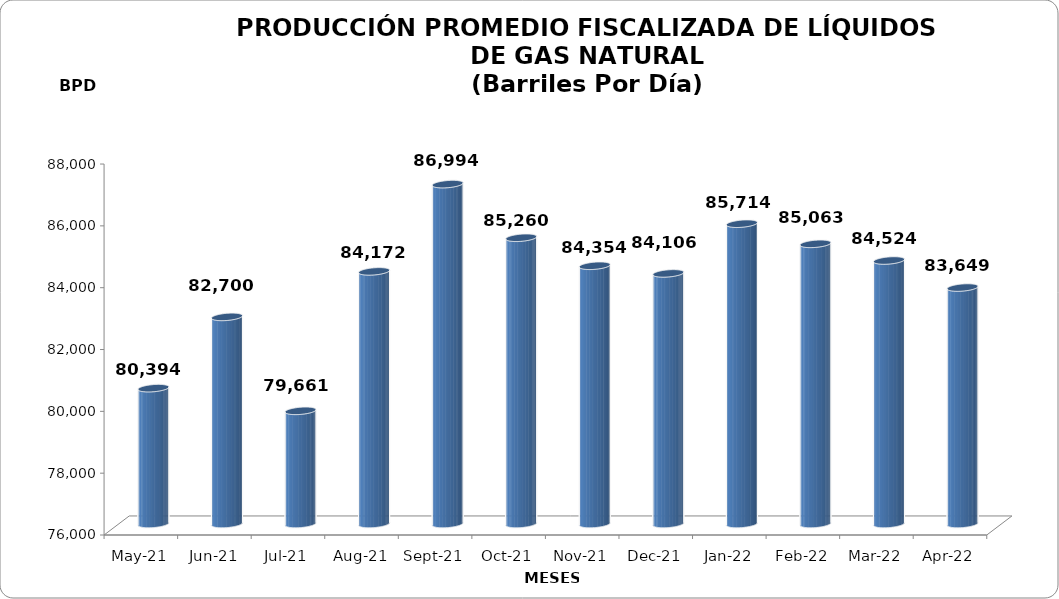
| Category | Series 0 |
|---|---|
| 2021-05-01 | 80393.645 |
| 2021-06-01 | 82699.833 |
| 2021-07-01 | 79661.29 |
| 2021-08-01 | 84171.548 |
| 2021-09-01 | 86994 |
| 2021-10-01 | 85260 |
| 2021-11-01 | 84354 |
| 2021-12-01 | 84106 |
| 2022-01-01 | 85714.355 |
| 2022-02-01 | 85063 |
| 2022-03-01 | 84523.548 |
| 2022-04-01 | 83649 |